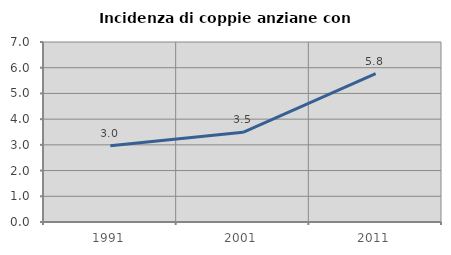
| Category | Incidenza di coppie anziane con figli |
|---|---|
| 1991.0 | 2.965 |
| 2001.0 | 3.488 |
| 2011.0 | 5.768 |